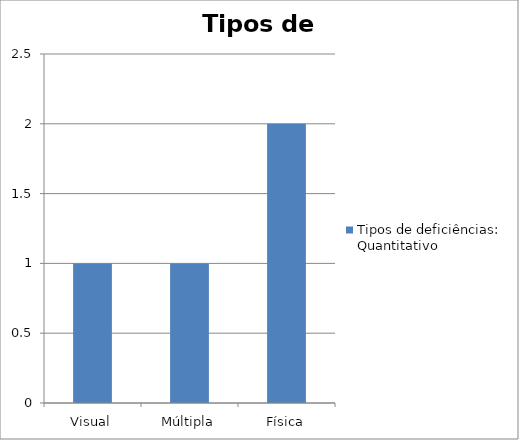
| Category | Tipos de deficiências: Quantitativo |
|---|---|
| Visual | 1 |
| Múltipla | 1 |
| Física | 2 |